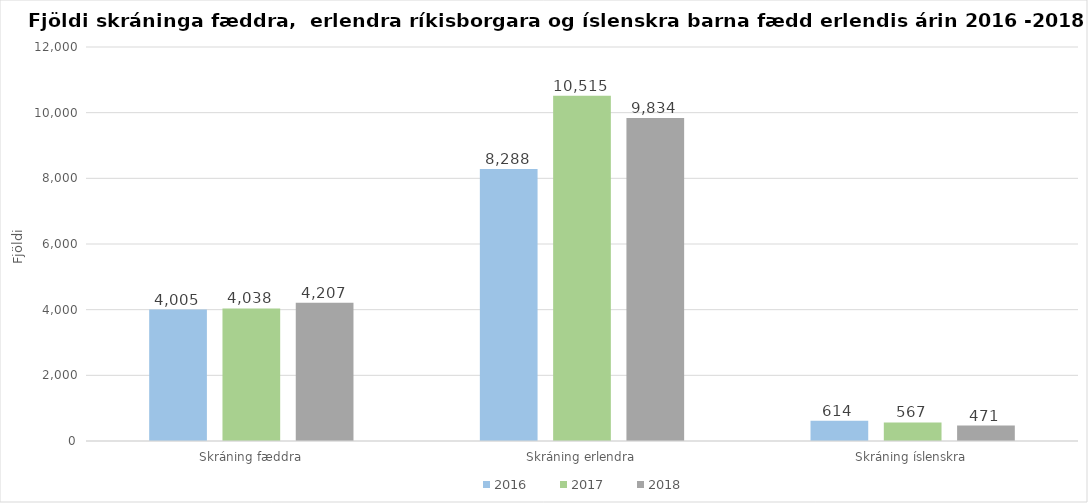
| Category | 2016 | 2017 | 2018 |
|---|---|---|---|
| Skráning fæddra | 4005 | 4038 | 4207 |
| Skráning erlendra | 8288 | 10515 | 9834 |
| Skráning íslenskra | 614 | 567 | 471 |